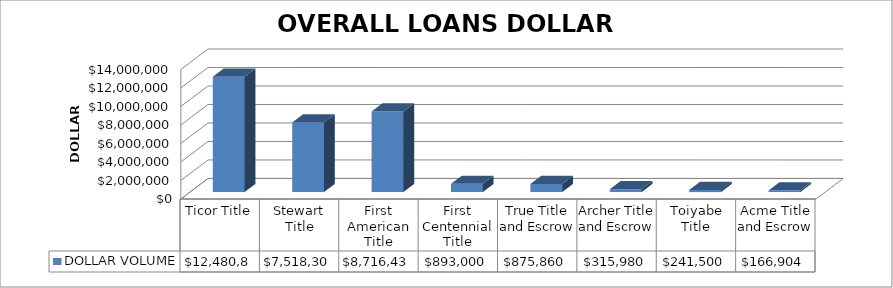
| Category | DOLLAR VOLUME |
|---|---|
| Ticor Title | 12480821 |
| Stewart Title | 7518304 |
| First American Title | 8716437 |
| First Centennial Title | 893000 |
| True Title and Escrow | 875860 |
| Archer Title and Escrow | 315980 |
| Toiyabe Title | 241500 |
| Acme Title and Escrow | 166904 |